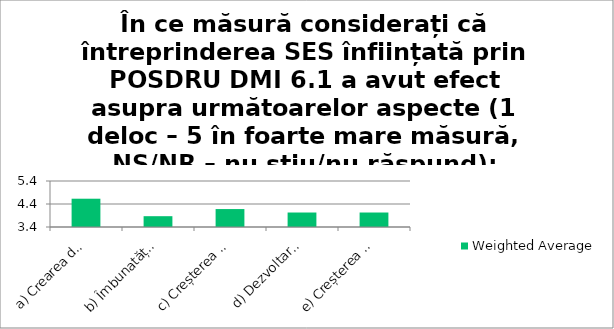
| Category | Weighted Average |
|---|---|
| a) Crearea de locuri de muncă pentru persoanele vulnerabile | 4.63 |
| b) Îmbunatățirea dezvoltării economiei locale prin serviciile/produsele dezvoltate de SES-urile înființate | 3.87 |
| c) Creșterea calității vieții persoanelor din grupuri vulnerabile aparținând comunității unde au fost furnizate serviciile oferite de SES-uri | 4.18 |
| d) Dezvoltarea competențelor, capacității persoanelor vulnerabile | 4.03 |
| e) Creșterea calității vieții persoanelor vulnerabile în cadrul comunității | 4.03 |